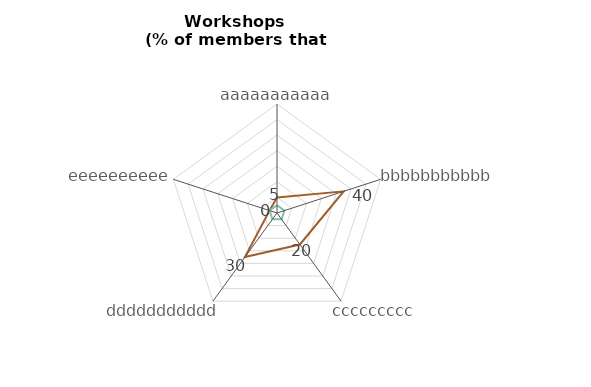
| Category | Series 0 | Series 1 |
|---|---|---|
| aaaaaaaaaaa | 5 |  |
| bbbbbbbbbbb | 40 |  |
| ccccccccc | 20 |  |
| ddddddddddd | 30 |  |
| eeeeeeeeee | 0 |  |